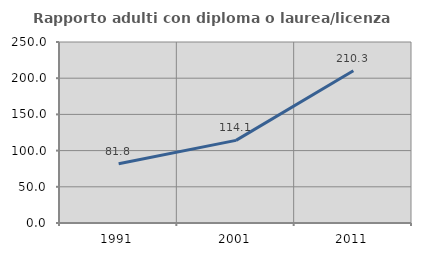
| Category | Rapporto adulti con diploma o laurea/licenza media  |
|---|---|
| 1991.0 | 81.818 |
| 2001.0 | 114.118 |
| 2011.0 | 210.294 |